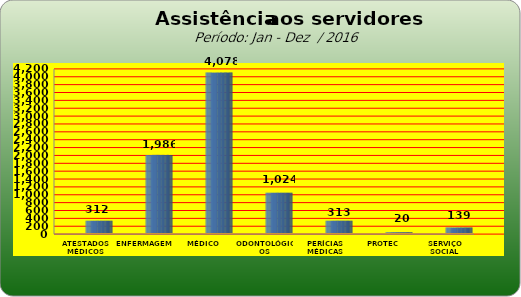
| Category | Series 0 |
|---|---|
| ATESTADOS MÉDICOS | 312 |
| ENFERMAGEM | 1986 |
| MÉDICO | 4078 |
| ODONTOLÓGICOS | 1024 |
| PERÍCIAS MÉDICAS | 313 |
| PROTEC | 20 |
| SERVIÇO SOCIAL | 139 |